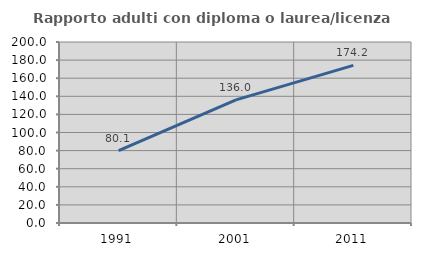
| Category | Rapporto adulti con diploma o laurea/licenza media  |
|---|---|
| 1991.0 | 80.093 |
| 2001.0 | 136.017 |
| 2011.0 | 174.208 |